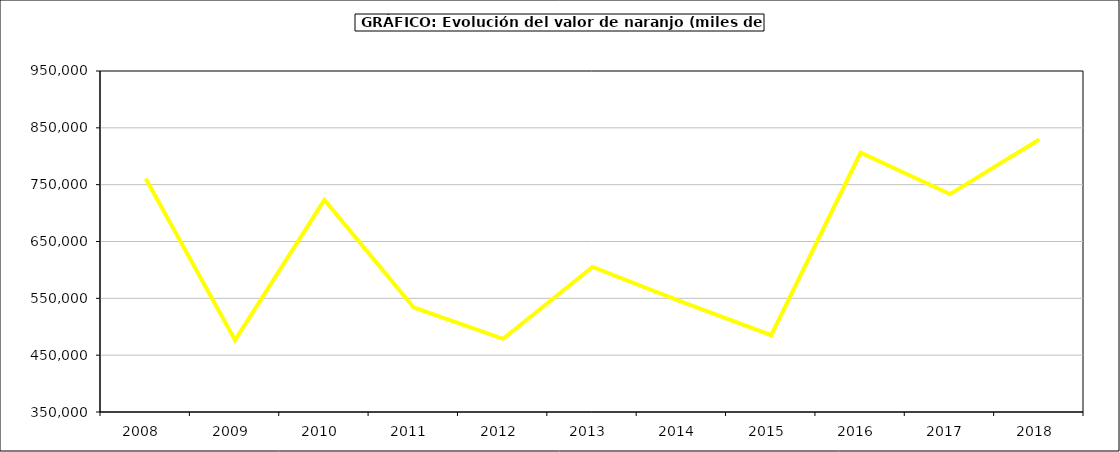
| Category | Valor |
|---|---|
| 2008.0 | 760835.253 |
| 2009.0 | 476479.868 |
| 2010.0 | 723258.418 |
| 2011.0 | 533897.387 |
| 2012.0 | 478708.956 |
| 2013.0 | 605137.07 |
| 2014.0 | 543774.818 |
| 2015.0 | 485218 |
| 2016.0 | 806164 |
| 2017.0 | 733433.06 |
| 2018.0 | 829436.538 |